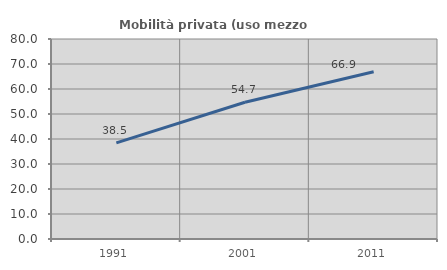
| Category | Mobilità privata (uso mezzo privato) |
|---|---|
| 1991.0 | 38.462 |
| 2001.0 | 54.702 |
| 2011.0 | 66.929 |